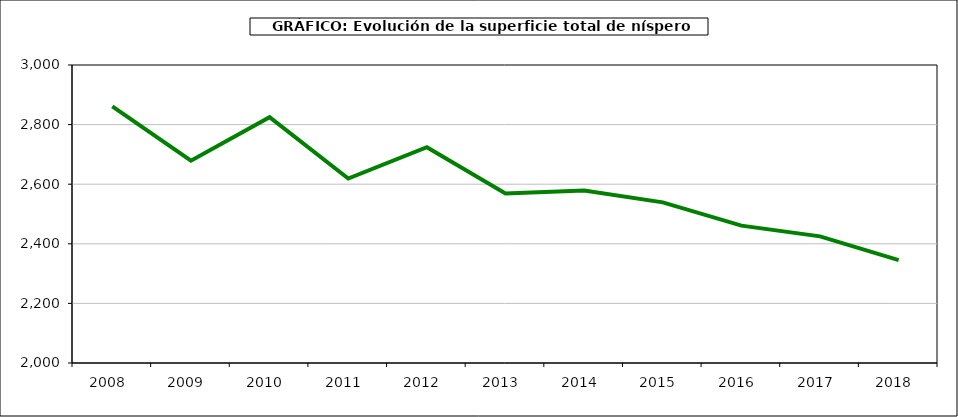
| Category | superficie níspero |
|---|---|
| 2008.0 | 2861 |
| 2009.0 | 2679 |
| 2010.0 | 2825 |
| 2011.0 | 2619 |
| 2012.0 | 2724 |
| 2013.0 | 2569 |
| 2014.0 | 2579 |
| 2015.0 | 2539 |
| 2016.0 | 2461 |
| 2017.0 | 2425 |
| 2018.0 | 2345 |